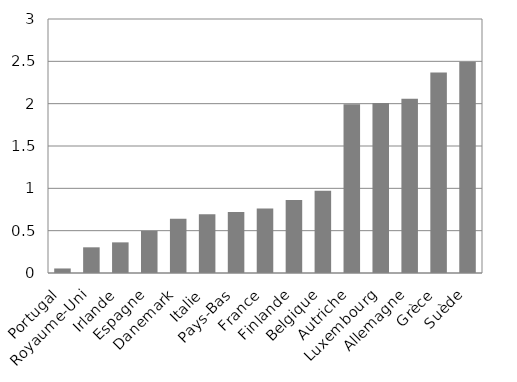
| Category | Colonne2 |
|---|---|
| Portugal | 0.054 |
| Royaume-Uni | 0.303 |
| Irlande | 0.362 |
| Espagne | 0.497 |
| Danemark | 0.64 |
| Italie | 0.695 |
| Pays-Bas | 0.72 |
| France | 0.761 |
| Finlande | 0.863 |
| Belgique | 0.971 |
| Autriche | 1.994 |
| Luxembourg | 2.009 |
| Allemagne | 2.058 |
| Grèce | 2.369 |
| Suède | 2.494 |